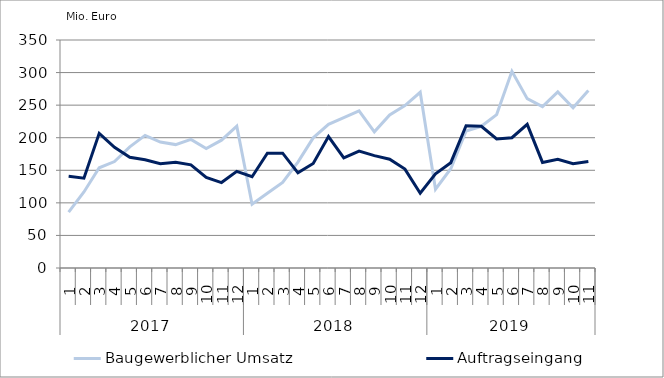
| Category | Baugewerblicher Umsatz | Auftragseingang |
|---|---|---|
| 0 | 85701.947 | 140751.008 |
| 1 | 116743.276 | 137863.383 |
| 2 | 153810.055 | 206710.579 |
| 3 | 163342.989 | 185183.797 |
| 4 | 185946.221 | 169878.51 |
| 5 | 203627.91 | 166148.392 |
| 6 | 193377.256 | 160134.206 |
| 7 | 189429.952 | 162221.206 |
| 8 | 197405.279 | 158305.285 |
| 9 | 183450.026 | 139156.761 |
| 10 | 196209.214 | 131165.419 |
| 11 | 217688.447 | 148434.901 |
| 12 | 97959.056 | 140119.385 |
| 13 | 114756.787 | 176330.213 |
| 14 | 131454.642 | 176241.061 |
| 15 | 162648.053 | 146063.407 |
| 16 | 199809.407 | 160551.931 |
| 17 | 220535.974 | 201835.846 |
| 18 | 230672.472 | 169132.23 |
| 19 | 241233.619 | 179396.293 |
| 20 | 209099.292 | 172542.764 |
| 21 | 234953.007 | 166991.729 |
| 22 | 249410.043 | 151835.629 |
| 23 | 269773.227 | 114807.456 |
| 24 | 120975.133 | 144510.881 |
| 25 | 152329.786 | 161685.201 |
| 26 | 210227.67 | 218455.879 |
| 27 | 217522.321 | 217610.064 |
| 28 | 235490.429 | 198110.439 |
| 29 | 301963.302 | 200012.086 |
| 30 | 259975.317 | 220559.061 |
| 31 | 247779.658 | 162059.723 |
| 32 | 270249.609 | 166829.611 |
| 33 | 245966.91 | 160120.773 |
| 34 | 272620.351 | 163589.389 |